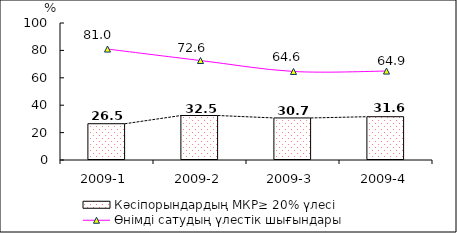
| Category | Кәсіпорындардың МКР≥ 20% үлесі |
|---|---|
| 2009-1 | 26.488 |
| 2009-2 | 32.473 |
| 2009-3 | 30.697 |
| 2009-4 | 31.598 |